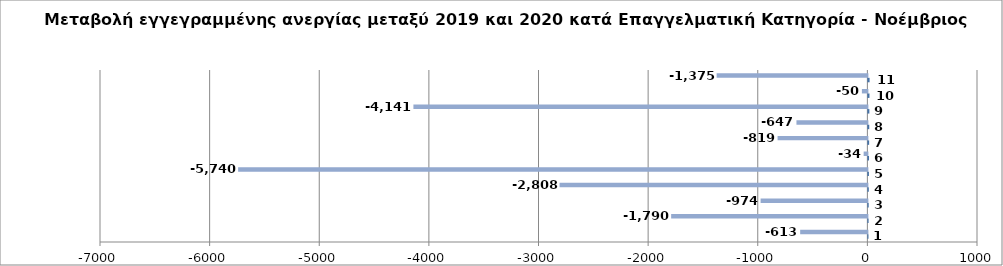
| Category | Series 0 | Series 1 |
|---|---|---|
| 0 | 1 | -613 |
| 1 | 2 | -1790 |
| 2 | 3 | -974 |
| 3 | 4 | -2808 |
| 4 | 5 | -5740 |
| 5 | 6 | -34 |
| 6 | 7 | -819 |
| 7 | 8 | -647 |
| 8 | 9 | -4141 |
| 9 | 10 | -50 |
| 10 | 11 | -1375 |